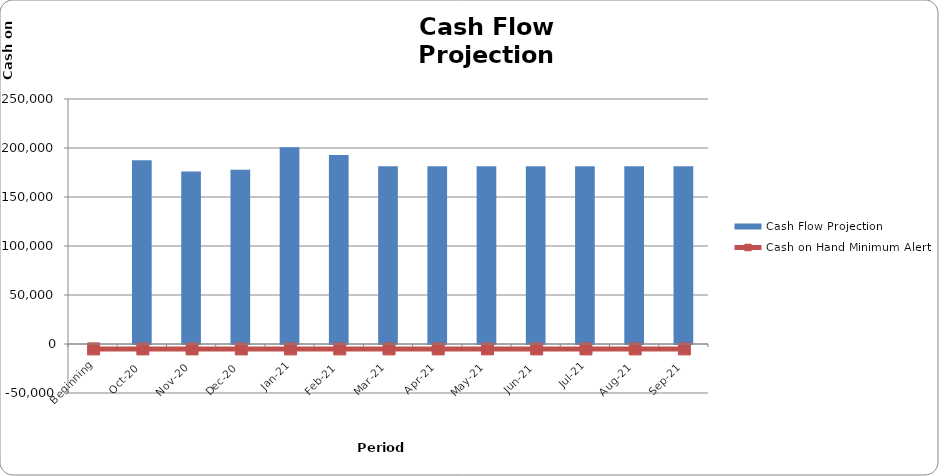
| Category | Cash Flow Projection |
|---|---|
| Beginning | 0 |
| Oct-20 | 187505.88 |
| Nov-20 | 176055.88 |
| Dec-20 | 177905.88 |
| Jan-21 | 200855.88 |
| Feb-21 | 192905.88 |
| Mar-21 | 181455.88 |
| Apr-21 | 181455.88 |
| May-21 | 181455.88 |
| Jun-21 | 181455.88 |
| Jul-21 | 181455.88 |
| Aug-21 | 181455.88 |
| Sep-21 | 181455.88 |